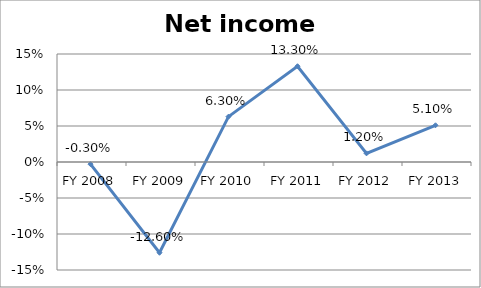
| Category | Net income ratio |
|---|---|
| FY 2013 | 0.051 |
| FY 2012 | 0.012 |
| FY 2011 | 0.133 |
| FY 2010 | 0.063 |
| FY 2009 | -0.126 |
| FY 2008 | -0.003 |